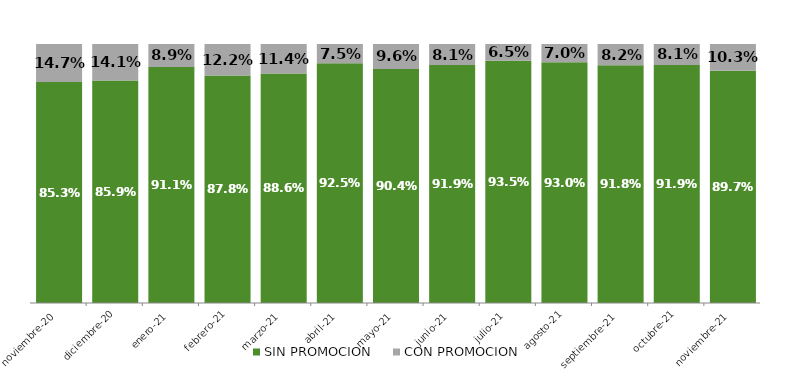
| Category | SIN PROMOCION   | CON PROMOCION   |
|---|---|---|
| 2020-11-01 | 0.853 | 0.147 |
| 2020-12-01 | 0.859 | 0.141 |
| 2021-01-01 | 0.911 | 0.089 |
| 2021-02-01 | 0.878 | 0.122 |
| 2021-03-01 | 0.886 | 0.114 |
| 2021-04-01 | 0.925 | 0.075 |
| 2021-05-01 | 0.904 | 0.096 |
| 2021-06-01 | 0.919 | 0.081 |
| 2021-07-01 | 0.935 | 0.065 |
| 2021-08-01 | 0.93 | 0.07 |
| 2021-09-01 | 0.918 | 0.082 |
| 2021-10-01 | 0.919 | 0.081 |
| 2021-11-01 | 0.897 | 0.103 |